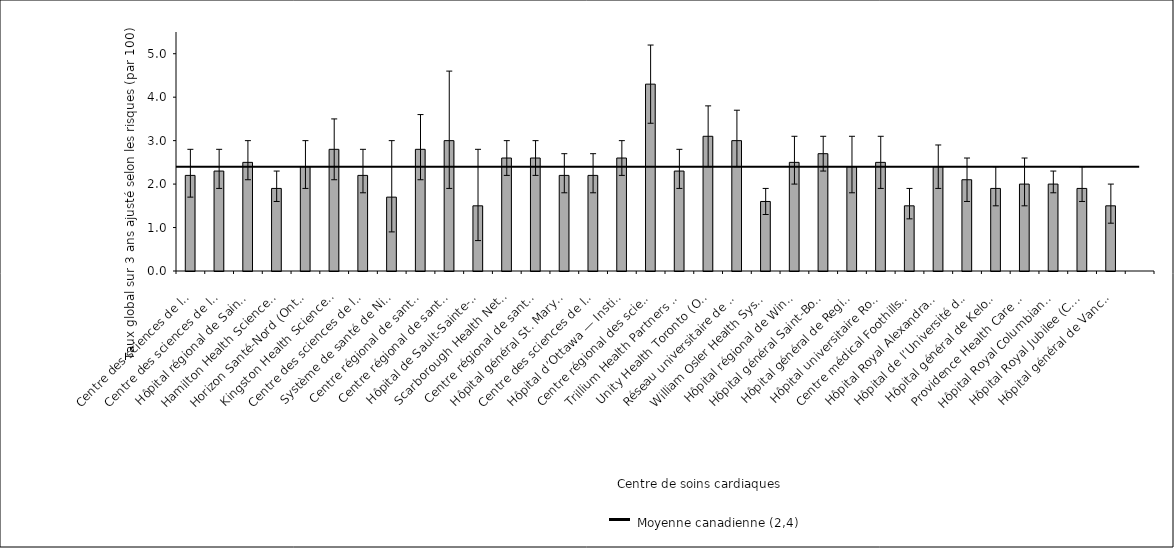
| Category | Taux 
ajusté selon 
les risques |
|---|---|
| Centre des sciences de la santé — St. John’s (T. -N.-L.) | 2.2 |
| Centre des sciences de la santé Queen Elizabeth II (N.-É.) | 2.3 |
| Hôpital régional de Saint John (N.-B.) | 2.5 |
| Hamilton Health Sciences* (Ont.) | 1.9 |
| Horizon Santé-Nord (Ont.) | 2.4 |
| Kingston Health Sciences Centre (Ont.) | 2.8 |
| Centre des sciences de la santé de London (Ont.) | 2.2 |
| Système de santé de Niagara (Ont.) | 1.7 |
| Centre régional de santé de Peterborough (Ont.) | 2.8 |
| Centre régional de santé Royal Victoria (Ont.) | 3 |
| Hôpital de Sault-Sainte-Marie (Ont.) | 1.5 |
| Scarborough Health Network (Ont.) | 2.6 |
| Centre régional de santé Southlake (Ont.) | 2.6 |
| Hôpital général St. Mary’s (Ont.) | 2.2 |
| Centre des sciences de la santé Sunnybrook (Ont.) | 2.2 |
| Hôpital d’Ottawa — Institut de cardiologie de l’Université d’Ottawa (Ont.) | 2.6 |
| Centre régional des sciences de la santé de Thunder Bay* (Ont.) | 4.3 |
| Trillium Health Partners (Ont.) | 2.3 |
| Unity Health Toronto (Ont.) | 3.1 |
| Réseau universitaire de santé (Ont.) | 3 |
| William Osler Health System* (Ont.) | 1.6 |
| Hôpital régional de Windsor (Ont.) | 2.5 |
| Hôpital général Saint-Boniface (Man.) | 2.7 |
| Hôpital général de Regina (Sask.) | 2.4 |
| Hôpital universitaire Royal (Sask.) | 2.5 |
| Centre médical Foothills* (Alb.) | 1.5 |
| Hôpital Royal Alexandra (Alb.) | 2.4 |
| Hôpital de l’Université de l’Alberta (Alb.) | 2.1 |
| Hôpital général de Kelowna (C.-B.) | 1.9 |
| Providence Health Care — Hôpital St. Paul’s (Vancouver) (C.-B.) | 2 |
| Hôpital Royal Columbian* (C.-B.) | 2 |
| Hôpital Royal Jubilee (C.-B.) | 1.9 |
| Hôpital général de Vancouver* (C.-B.) | 1.5 |